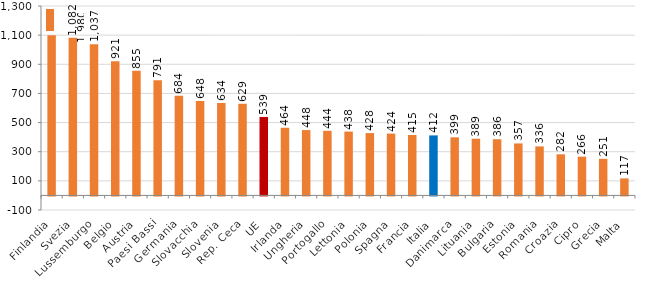
| Category | Series 0 |
|---|---|
| Finlandia | 1100 |
| Svezia | 1081.638 |
| Lussemburgo | 1037.332 |
| Belgio | 921.318 |
| Austria | 855.076 |
| Paesi Bassi | 791.205 |
| Germania | 684.341 |
| Slovacchia | 647.85 |
| Slovenia | 633.544 |
| Rep. Ceca | 629.305 |
| UE | 538.765 |
| Irlanda | 464.366 |
| Ungheria | 448.458 |
| Portogallo | 443.606 |
| Lettonia | 438.262 |
| Polonia | 427.817 |
| Spagna | 424.322 |
| Francia | 414.634 |
| Italia | 411.952 |
| Danimarca | 398.841 |
| Lituania | 389.183 |
| Bulgaria | 385.643 |
| Estonia | 356.786 |
| Romania | 336.416 |
| Croazia | 282.291 |
| Cipro | 266.171 |
| Grecia | 250.955 |
| Malta | 117.071 |